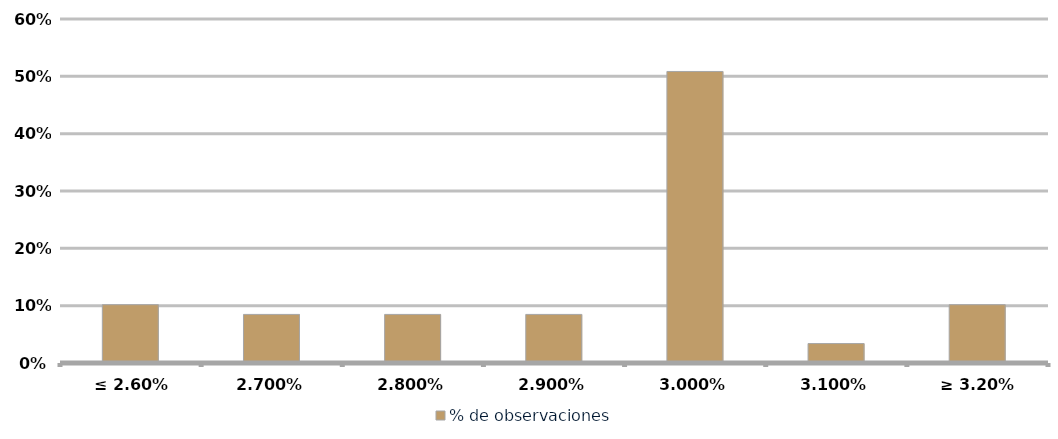
| Category | % de observaciones  |
|---|---|
| ≤ 2.60% | 0.102 |
| 2.70% | 0.085 |
| 2.80% | 0.085 |
| 2.90% | 0.085 |
| 3.00% | 0.508 |
| 3.10% | 0.034 |
| ≥ 3.20% | 0.102 |